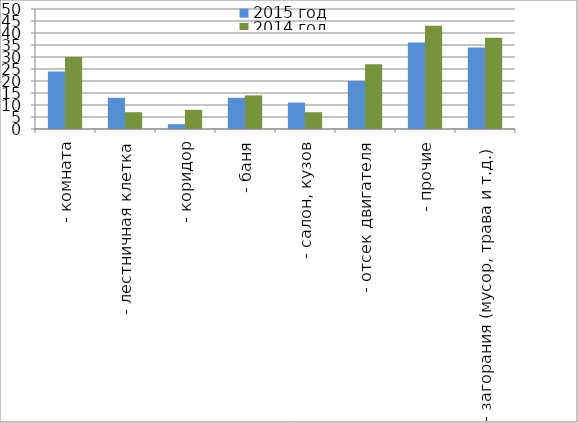
| Category | 2015 год | 2014 год |
|---|---|---|
|  - комната | 24 | 30 |
|  - лестничная клетка | 13 | 7 |
|  - коридор | 2 | 8 |
|  - баня | 13 | 14 |
|  - салон, кузов | 11 | 7 |
|  - отсек двигателя | 20 | 27 |
| - прочие | 36 | 43 |
| - загорания (мусор, трава и т.д.)  | 34 | 38 |